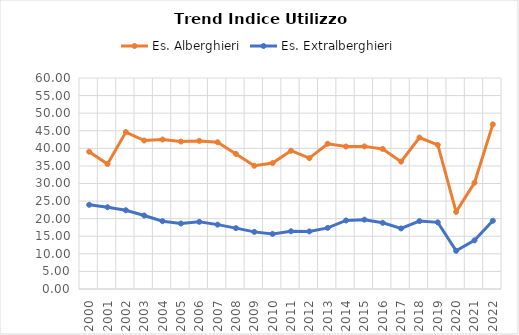
| Category | Es. Alberghieri | Es. Extralberghieri |
|---|---|---|
| 2000.0 | 39.036 | 23.942 |
| 2001.0 | 35.52 | 23.257 |
| 2002.0 | 44.62 | 22.393 |
| 2003.0 | 42.223 | 20.904 |
| 2004.0 | 42.505 | 19.285 |
| 2005.0 | 41.923 | 18.627 |
| 2006.0 | 42.112 | 19.106 |
| 2007.0 | 41.727 | 18.305 |
| 2008.0 | 38.411 | 17.312 |
| 2009.0 | 35.037 | 16.245 |
| 2010.0 | 35.808 | 15.663 |
| 2011.0 | 39.318 | 16.419 |
| 2012.0 | 37.211 | 16.374 |
| 2013.0 | 41.311 | 17.381 |
| 2014.0 | 40.514 | 19.487 |
| 2015.0 | 40.554 | 19.721 |
| 2016.0 | 39.829 | 18.822 |
| 2017.0 | 36.214 | 17.217 |
| 2018.0 | 43.074 | 19.313 |
| 2019.0 | 40.973 | 18.948 |
| 2020.0 | 21.92 | 10.858 |
| 2021.0 | 30.215 | 13.829 |
| 2022.0 | 46.821 | 19.403 |